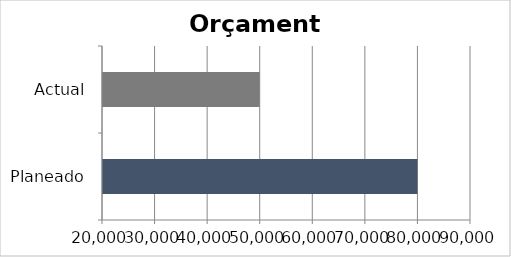
| Category | Series 0 |
|---|---|
| Planeado | 80000 |
| Actual | 50000 |